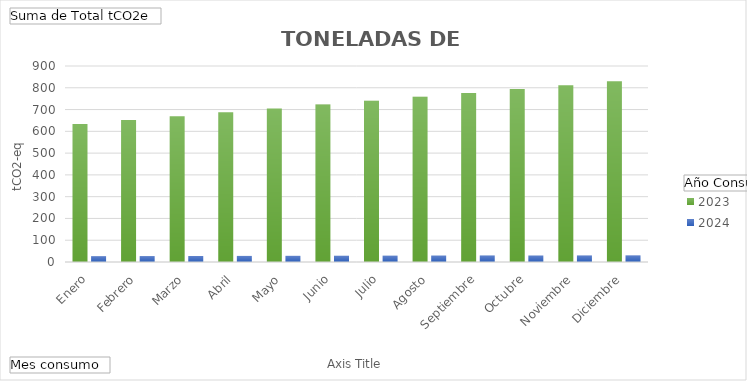
| Category | 2023 | 2024 |
|---|---|---|
| Enero | 633.818 | 26.912 |
| Febrero | 651.626 | 27.248 |
| Marzo | 669.435 | 27.585 |
| Abril | 687.244 | 27.921 |
| Mayo | 705.053 | 28.258 |
| Junio | 722.861 | 28.594 |
| Julio | 740.67 | 28.93 |
| Agosto | 758.479 | 29.267 |
| Septiembre | 776.288 | 29.603 |
| Octubre | 794.096 | 29.94 |
| Noviembre | 811.905 | 30.276 |
| Diciembre | 829.714 | 30.612 |